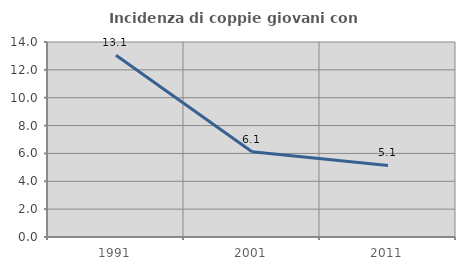
| Category | Incidenza di coppie giovani con figli |
|---|---|
| 1991.0 | 13.054 |
| 2001.0 | 6.122 |
| 2011.0 | 5.139 |